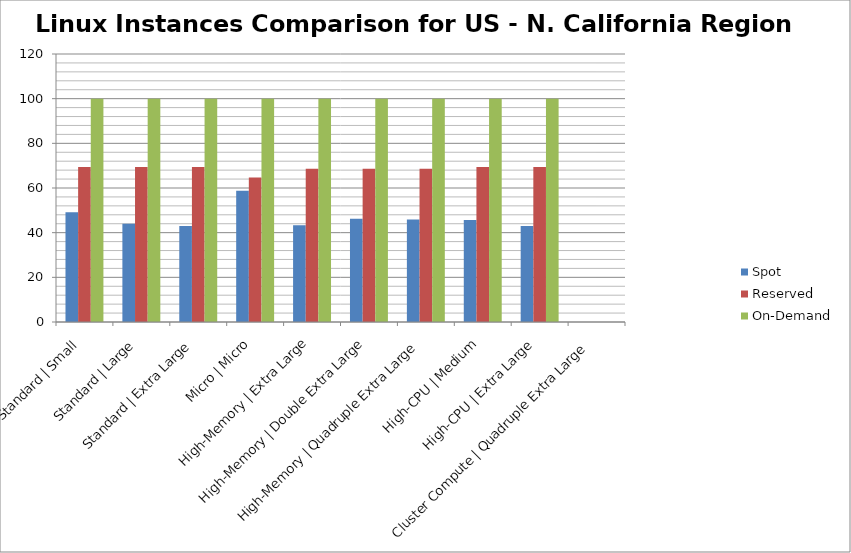
| Category | Spot | Reserved | On-Demand |
|---|---|---|---|
| Standard | Small | 49.158 | 69.442 | 100 |
| Standard | Large | 44 | 69.442 | 100 |
| Standard | Extra Large | 42.987 | 69.442 | 100 |
| Micro | Micro | 58.8 | 64.658 | 100 |
| High-Memory | Extra Large | 43.281 | 68.641 | 100 |
| High-Memory | Double Extra Large | 46.228 | 68.641 | 100 |
| High-Memory | Quadruple Extra Large | 45.912 | 68.641 | 100 |
| High-CPU | Medium | 45.632 | 69.442 | 100 |
| High-CPU | Extra Large | 42.987 | 69.442 | 100 |
| Cluster Compute | Quadruple Extra Large | 0 | 0 | 0 |